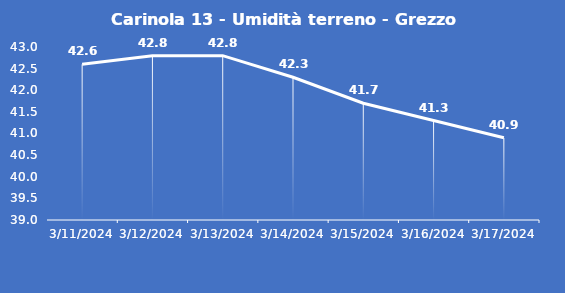
| Category | Carinola 13 - Umidità terreno - Grezzo (%VWC) |
|---|---|
| 3/11/24 | 42.6 |
| 3/12/24 | 42.8 |
| 3/13/24 | 42.8 |
| 3/14/24 | 42.3 |
| 3/15/24 | 41.7 |
| 3/16/24 | 41.3 |
| 3/17/24 | 40.9 |